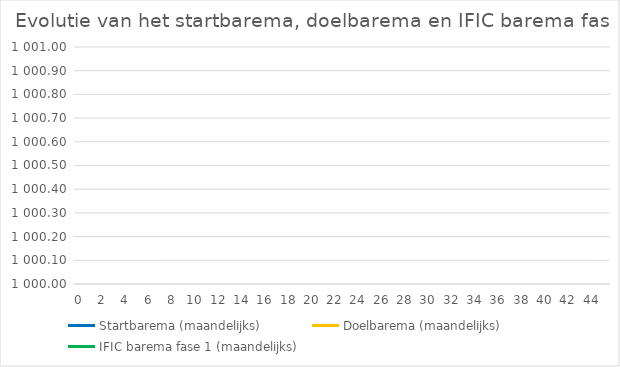
| Category | Startbarema (maandelijks) | Doelbarema | Doelbarema (maandelijks) | Delta | IFIC barema fase 1 (maandelijks) |
|---|---|---|---|---|---|
| 0.0 | 0 |  | 0 |  | 0 |
| 1.0 | 0 |  | 0 |  | 0 |
| 2.0 | 0 |  | 0 |  | 0 |
| 3.0 | 0 |  | 0 |  | 0 |
| 4.0 | 0 |  | 0 |  | 0 |
| 5.0 | 0 |  | 0 |  | 0 |
| 6.0 | 0 |  | 0 |  | 0 |
| 7.0 | 0 |  | 0 |  | 0 |
| 8.0 | 0 |  | 0 |  | 0 |
| 9.0 | 0 |  | 0 |  | 0 |
| 10.0 | 0 |  | 0 |  | 0 |
| 11.0 | 0 |  | 0 |  | 0 |
| 12.0 | 0 |  | 0 |  | 0 |
| 13.0 | 0 |  | 0 |  | 0 |
| 14.0 | 0 |  | 0 |  | 0 |
| 15.0 | 0 |  | 0 |  | 0 |
| 16.0 | 0 |  | 0 |  | 0 |
| 17.0 | 0 |  | 0 |  | 0 |
| 18.0 | 0 |  | 0 |  | 0 |
| 19.0 | 0 |  | 0 |  | 0 |
| 20.0 | 0 |  | 0 |  | 0 |
| 21.0 | 0 |  | 0 |  | 0 |
| 22.0 | 0 |  | 0 |  | 0 |
| 23.0 | 0 |  | 0 |  | 0 |
| 24.0 | 0 |  | 0 |  | 0 |
| 25.0 | 0 |  | 0 |  | 0 |
| 26.0 | 0 |  | 0 |  | 0 |
| 27.0 | 0 |  | 0 |  | 0 |
| 28.0 | 0 |  | 0 |  | 0 |
| 29.0 | 0 |  | 0 |  | 0 |
| 30.0 | 0 |  | 0 |  | 0 |
| 31.0 | 0 |  | 0 |  | 0 |
| 32.0 | 0 |  | 0 |  | 0 |
| 33.0 | 0 |  | 0 |  | 0 |
| 34.0 | 0 |  | 0 |  | 0 |
| 35.0 | 0 |  | 0 |  | 0 |
| 36.0 | 0 |  | 0 |  | 0 |
| 37.0 | 0 |  | 0 |  | 0 |
| 38.0 | 0 |  | 0 |  | 0 |
| 39.0 | 0 |  | 0 |  | 0 |
| 40.0 | 0 |  | 0 |  | 0 |
| 41.0 | 0 |  | 0 |  | 0 |
| 42.0 | 0 |  | 0 |  | 0 |
| 43.0 | 0 |  | 0 |  | 0 |
| 44.0 | 0 |  | 0 |  | 0 |
| 45.0 | 0 |  | 0 |  | 0 |